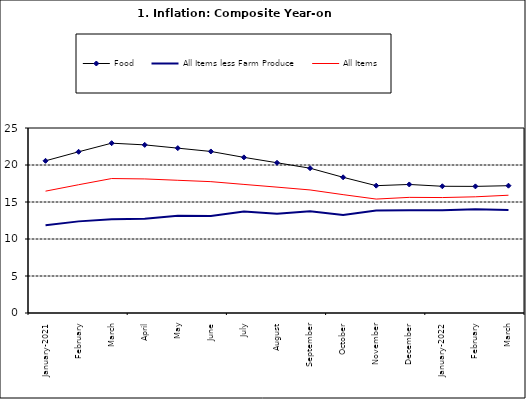
| Category | Food | All Items less Farm Produce | All Items |
|---|---|---|---|
| January-2021 | 20.567 | 11.854 | 16.466 |
| February | 21.786 | 12.382 | 17.335 |
| March | 22.948 | 12.673 | 18.171 |
| April | 22.719 | 12.743 | 18.117 |
| May | 22.277 | 13.145 | 17.933 |
| June | 21.829 | 13.094 | 17.751 |
| July | 21.032 | 13.72 | 17.377 |
| August | 20.303 | 13.408 | 17.009 |
| September | 19.566 | 13.745 | 16.63 |
| October | 18.338 | 13.24 | 15.994 |
| November | 17.209 | 13.851 | 15.396 |
| December | 17.37 | 13.873 | 15.625 |
| January-2022 | 17.126 | 13.869 | 15.601 |
| February | 17.11 | 14.011 | 15.702 |
| March | 17.203 | 13.914 | 15.915 |